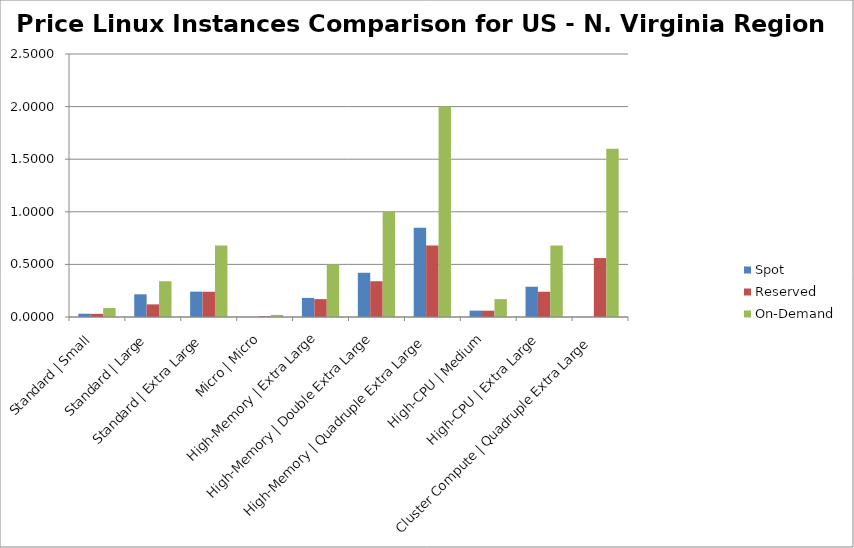
| Category | Spot | Reserved | On-Demand |
|---|---|---|---|
| Standard | Small | 0.031 | 0.03 | 0.085 |
| Standard | Large | 0.216 | 0.12 | 0.34 |
| Standard | Extra Large | 0.241 | 0.24 | 0.68 |
| Micro | Micro | 0 | 0.007 | 0.02 |
| High-Memory | Extra Large | 0.181 | 0.17 | 0.5 |
| High-Memory | Double Extra Large | 0.42 | 0.34 | 1 |
| High-Memory | Quadruple Extra Large | 0.848 | 0.68 | 2 |
| High-CPU | Medium | 0.061 | 0.06 | 0.17 |
| High-CPU | Extra Large | 0.288 | 0.24 | 0.68 |
| Cluster Compute | Quadruple Extra Large | 0 | 0.56 | 1.6 |